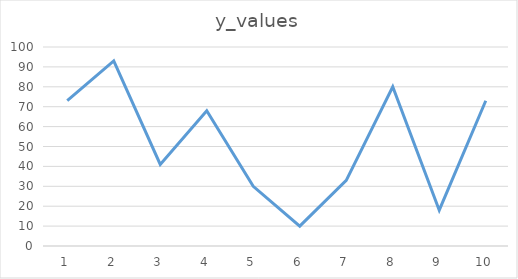
| Category | y_values |
|---|---|
| 0 | 73 |
| 1 | 93 |
| 2 | 41 |
| 3 | 68 |
| 4 | 30 |
| 5 | 10 |
| 6 | 33 |
| 7 | 80 |
| 8 | 18 |
| 9 | 73 |